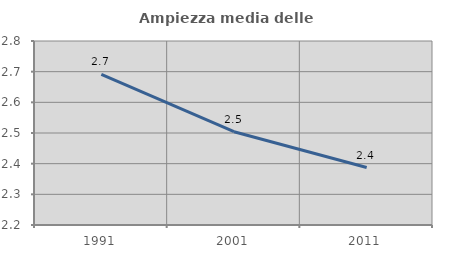
| Category | Ampiezza media delle famiglie |
|---|---|
| 1991.0 | 2.691 |
| 2001.0 | 2.504 |
| 2011.0 | 2.387 |